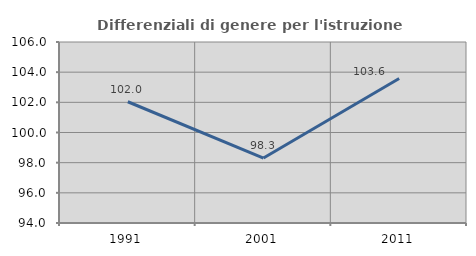
| Category | Differenziali di genere per l'istruzione superiore |
|---|---|
| 1991.0 | 102.038 |
| 2001.0 | 98.306 |
| 2011.0 | 103.577 |